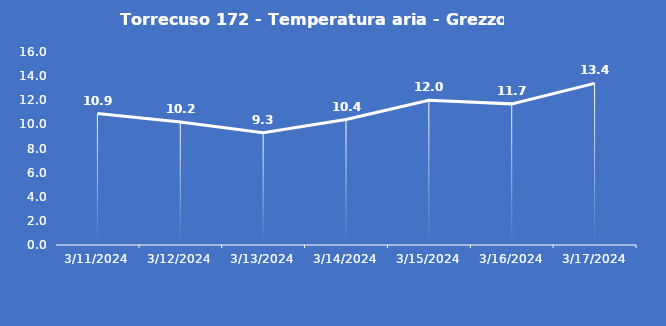
| Category | Torrecuso 172 - Temperatura aria - Grezzo (°C) |
|---|---|
| 3/11/24 | 10.9 |
| 3/12/24 | 10.2 |
| 3/13/24 | 9.3 |
| 3/14/24 | 10.4 |
| 3/15/24 | 12 |
| 3/16/24 | 11.7 |
| 3/17/24 | 13.4 |